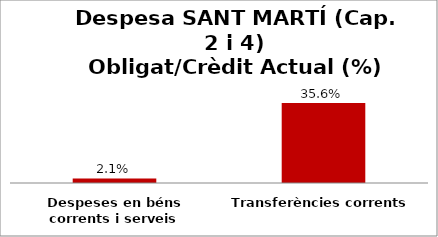
| Category | Series 0 |
|---|---|
| Despeses en béns corrents i serveis | 0.021 |
| Transferències corrents | 0.356 |